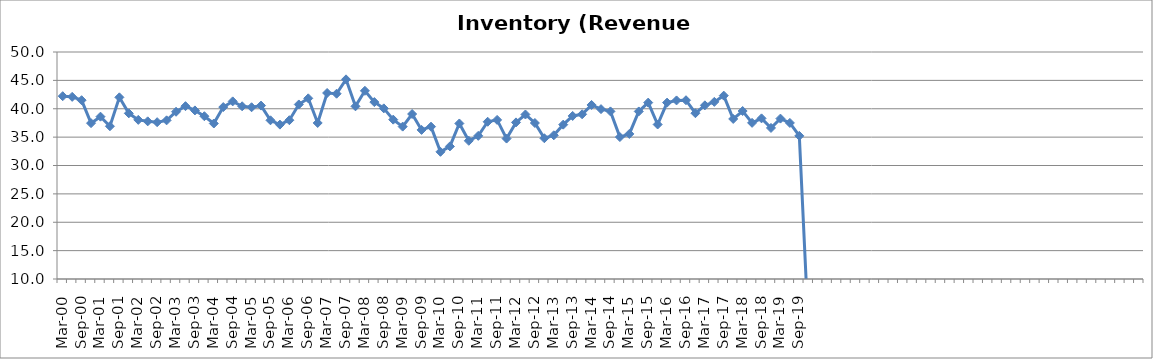
| Category | Inventory (Revenue Days) |
|---|---|
| Mar-00 | 42.213 |
| Jun-00 | 42.098 |
| Sep-00 | 41.508 |
| Dec-00 | 37.462 |
| Mar-01 | 38.607 |
| Jun-01 | 36.919 |
| Sep-01 | 42.01 |
| Dec-01 | 39.192 |
| Mar-02 | 38.042 |
| Jun-02 | 37.783 |
| Sep-02 | 37.632 |
| Dec-02 | 37.956 |
| Mar-03 | 39.469 |
| Jun-03 | 40.457 |
| Sep-03 | 39.706 |
| Dec-03 | 38.686 |
| Mar-04 | 37.401 |
| Jun-04 | 40.296 |
| Sep-04 | 41.298 |
| Dec-04 | 40.434 |
| Mar-05 | 40.263 |
| Jun-05 | 40.558 |
| Sep-05 | 37.968 |
| Dec-05 | 37.204 |
| Mar-06 | 37.982 |
| Jun-06 | 40.757 |
| Sep-06 | 41.835 |
| Dec-06 | 37.496 |
| Mar-07 | 42.778 |
| Jun-07 | 42.649 |
| Sep-07 | 45.181 |
| Dec-07 | 40.431 |
| Mar-08 | 43.164 |
| Jun-08 | 41.171 |
| Sep-08 | 40.067 |
| Dec-08 | 38.078 |
| Mar-09 | 36.851 |
| Jun-09 | 39.074 |
| Sep-09 | 36.272 |
| Dec-09 | 36.84 |
| Mar-10 | 32.411 |
| Jun-10 | 33.365 |
| Sep-10 | 37.406 |
| Dec-10 | 34.355 |
| Mar-11 | 35.226 |
| Jun-11 | 37.707 |
| Sep-11 | 38.036 |
| Dec-11 | 34.745 |
| Mar-12 | 37.596 |
| Jun-12 | 38.989 |
| Sep-12 | 37.488 |
| Dec-12 | 34.803 |
| Mar-13 | 35.322 |
| Jun-13 | 37.198 |
| Sep-13 | 38.736 |
| Dec-13 | 39.027 |
| Mar-14 | 40.669 |
| Jun-14 | 39.934 |
| Sep-14 | 39.532 |
| Dec-14 | 35.012 |
| Mar-15 | 35.564 |
| Jun-15 | 39.524 |
| Sep-15 | 41.084 |
| Dec-15 | 37.225 |
| Mar-16 | 41.082 |
| Jun-16 | 41.467 |
| Sep-16 | 41.5 |
| Dec-16 | 39.214 |
| Mar-17 | 40.6 |
| Jun-17 | 41.21 |
| Sep-17 | 42.313 |
| Dec-17 | 38.201 |
| Mar-18 | 39.599 |
| Jun-18 | 37.514 |
| Sep-18 | 38.306 |
| Dec-18 | 36.616 |
| Mar-19 | 38.264 |
| Jun-19 | 37.503 |
| Sep-19 | 35.221 |